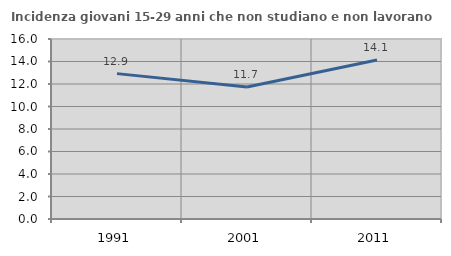
| Category | Incidenza giovani 15-29 anni che non studiano e non lavorano  |
|---|---|
| 1991.0 | 12.923 |
| 2001.0 | 11.729 |
| 2011.0 | 14.137 |